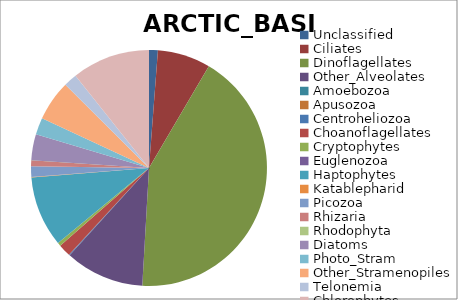
| Category | ARCTIC_BASIN |
|---|---|
| Unclassified | 0.012 |
| Ciliates | 0.073 |
| Dinoflagellates | 0.424 |
| Other_Alveolates | 0.108 |
| Amoebozoa | 0 |
| Apusozoa | 0 |
| Centroheliozoa | 0.001 |
| Choanoflagellates | 0.017 |
| Cryptophytes | 0.005 |
| Euglenozoa | 0 |
| Haptophytes | 0.097 |
| Katablepharid | 0.001 |
| Picozoa | 0.014 |
| Rhizaria | 0.008 |
| Rhodophyta | 0 |
| Diatoms | 0.036 |
| Photo_Stram | 0.023 |
| Other_Stramenopiles | 0.055 |
| Telonemia | 0.018 |
| Chlorophytes | 0.107 |